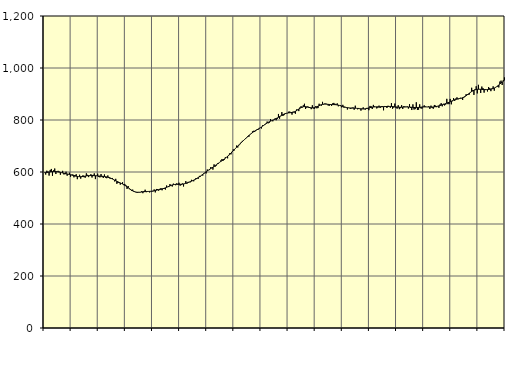
| Category | Piggar | Series 1 |
|---|---|---|
| nan | 598.3 | 597.13 |
| 87.0 | 590.2 | 597.61 |
| 87.0 | 604.9 | 598.3 |
| 87.0 | 601.5 | 599.08 |
| 87.0 | 586.2 | 599.73 |
| 87.0 | 607.9 | 600.44 |
| 87.0 | 611.7 | 601 |
| 87.0 | 585.3 | 601.47 |
| 87.0 | 606.5 | 601.78 |
| 87.0 | 613.4 | 601.8 |
| 87.0 | 592.2 | 601.57 |
| 87.0 | 601.4 | 601.05 |
| nan | 604.4 | 600.31 |
| 88.0 | 601.5 | 599.45 |
| 88.0 | 589.5 | 598.5 |
| 88.0 | 597.8 | 597.49 |
| 88.0 | 604.4 | 596.5 |
| 88.0 | 591 | 595.5 |
| 88.0 | 591.3 | 594.48 |
| 88.0 | 601.1 | 593.48 |
| 88.0 | 585.7 | 592.5 |
| 88.0 | 592.2 | 591.46 |
| 88.0 | 597.2 | 590.37 |
| 88.0 | 582 | 589.27 |
| nan | 589.6 | 588.13 |
| 89.0 | 590.7 | 586.98 |
| 89.0 | 579.5 | 585.85 |
| 89.0 | 588.3 | 584.75 |
| 89.0 | 591.4 | 583.74 |
| 89.0 | 572.4 | 582.9 |
| 89.0 | 582.8 | 582.31 |
| 89.0 | 589.4 | 582.03 |
| 89.0 | 574.5 | 582.03 |
| 89.0 | 580.7 | 582.28 |
| 89.0 | 587.4 | 582.78 |
| 89.0 | 579.9 | 583.46 |
| nan | 578.3 | 584.21 |
| 90.0 | 594.9 | 584.93 |
| 90.0 | 589.1 | 585.56 |
| 90.0 | 580.4 | 586.03 |
| 90.0 | 585.7 | 586.28 |
| 90.0 | 591.7 | 586.37 |
| 90.0 | 578.8 | 586.32 |
| 90.0 | 589 | 586.12 |
| 90.0 | 594.6 | 585.86 |
| 90.0 | 572.7 | 585.58 |
| 90.0 | 586.1 | 585.25 |
| 90.0 | 593.4 | 584.92 |
| nan | 580.6 | 584.61 |
| 91.0 | 579.4 | 584.27 |
| 91.0 | 592.1 | 583.88 |
| 91.0 | 580.3 | 583.48 |
| 91.0 | 577.1 | 583.04 |
| 91.0 | 590.6 | 582.49 |
| 91.0 | 578.1 | 581.81 |
| 91.0 | 576.2 | 580.98 |
| 91.0 | 586.6 | 579.93 |
| 91.0 | 580.8 | 578.66 |
| 91.0 | 574.1 | 577.12 |
| 91.0 | 574.4 | 575.28 |
| nan | 577 | 573.14 |
| 92.0 | 569.6 | 570.84 |
| 92.0 | 563.9 | 568.49 |
| 92.0 | 573.7 | 566.15 |
| 92.0 | 554.6 | 563.93 |
| 92.0 | 558.2 | 561.86 |
| 92.0 | 561.4 | 559.9 |
| 92.0 | 551.4 | 558 |
| 92.0 | 556.4 | 556.03 |
| 92.0 | 560.5 | 553.89 |
| 92.0 | 549.5 | 551.52 |
| 92.0 | 554.1 | 548.92 |
| nan | 549.1 | 546.04 |
| 93.0 | 535 | 542.91 |
| 93.0 | 545.9 | 539.64 |
| 93.0 | 534 | 536.31 |
| 93.0 | 530.6 | 533.08 |
| 93.0 | 527.6 | 530.13 |
| 93.0 | 532.2 | 527.54 |
| 93.0 | 523.9 | 525.43 |
| 93.0 | 524 | 523.83 |
| 93.0 | 521.6 | 522.74 |
| 93.0 | 519.7 | 522.13 |
| 93.0 | 523.2 | 521.96 |
| nan | 521.1 | 522.15 |
| 94.0 | 521.7 | 522.59 |
| 94.0 | 526.4 | 523.16 |
| 94.0 | 518.5 | 523.74 |
| 94.0 | 526.5 | 524.28 |
| 94.0 | 531.9 | 524.68 |
| 94.0 | 522.3 | 524.95 |
| 94.0 | 526.3 | 525.11 |
| 94.0 | 525.8 | 525.23 |
| 94.0 | 521.4 | 525.42 |
| 94.0 | 526.2 | 525.74 |
| 94.0 | 524.7 | 526.27 |
| nan | 525.8 | 527.02 |
| 95.0 | 532.9 | 527.95 |
| 95.0 | 521.6 | 528.97 |
| 95.0 | 534.7 | 530.02 |
| 95.0 | 534.2 | 531.04 |
| 95.0 | 528.1 | 531.95 |
| 95.0 | 535.3 | 532.84 |
| 95.0 | 537.8 | 533.77 |
| 95.0 | 529.7 | 534.82 |
| 95.0 | 538.4 | 536.06 |
| 95.0 | 534.5 | 537.52 |
| 95.0 | 532.6 | 539.17 |
| nan | 548 | 540.97 |
| 96.0 | 543.3 | 542.88 |
| 96.0 | 542 | 544.85 |
| 96.0 | 553.7 | 546.78 |
| 96.0 | 549.2 | 548.56 |
| 96.0 | 544.2 | 550.1 |
| 96.0 | 555.2 | 551.27 |
| 96.0 | 551.3 | 552.03 |
| 96.0 | 549.1 | 552.42 |
| 96.0 | 556.4 | 552.55 |
| 96.0 | 554.4 | 552.56 |
| 96.0 | 558.6 | 552.55 |
| nan | 547.3 | 552.62 |
| 97.0 | 549.7 | 552.86 |
| 97.0 | 555.9 | 553.35 |
| 97.0 | 544.3 | 554.11 |
| 97.0 | 555.8 | 555.11 |
| 97.0 | 564.8 | 556.39 |
| 97.0 | 555.1 | 557.88 |
| 97.0 | 562 | 559.52 |
| 97.0 | 560.5 | 561.24 |
| 97.0 | 560.3 | 563.01 |
| 97.0 | 569.9 | 564.77 |
| 97.0 | 565.4 | 566.58 |
| nan | 564.3 | 568.53 |
| 98.0 | 569.7 | 570.68 |
| 98.0 | 576.7 | 573.05 |
| 98.0 | 576.6 | 575.65 |
| 98.0 | 573.8 | 578.45 |
| 98.0 | 585 | 581.38 |
| 98.0 | 582.5 | 584.45 |
| 98.0 | 588.6 | 587.64 |
| 98.0 | 586.1 | 590.9 |
| 98.0 | 596 | 594.23 |
| 98.0 | 597.4 | 597.54 |
| 98.0 | 594.6 | 600.79 |
| nan | 609.6 | 603.97 |
| 99.0 | 607.6 | 607.04 |
| 99.0 | 607.3 | 609.95 |
| 99.0 | 618.3 | 612.76 |
| 99.0 | 617.3 | 615.58 |
| 99.0 | 609.2 | 618.45 |
| 99.0 | 629.3 | 621.39 |
| 99.0 | 620.4 | 624.46 |
| 99.0 | 624.6 | 627.64 |
| 99.0 | 632.9 | 630.88 |
| 99.0 | 632.1 | 634.16 |
| 99.0 | 637.5 | 637.45 |
| nan | 644.7 | 640.67 |
| 0.0 | 649.6 | 643.8 |
| 0.0 | 642.9 | 646.91 |
| 0.0 | 646.7 | 650.01 |
| 0.0 | 656.7 | 653.2 |
| 0.0 | 656.8 | 656.61 |
| 0.0 | 652.6 | 660.3 |
| 0.0 | 665.8 | 664.23 |
| 0.0 | 672.7 | 668.43 |
| 0.0 | 667.9 | 672.8 |
| 0.0 | 678.5 | 677.3 |
| 0.0 | 686.9 | 681.86 |
| nan | 683.2 | 686.41 |
| 1.0 | 690.5 | 690.92 |
| 1.0 | 701.7 | 695.4 |
| 1.0 | 694.2 | 699.87 |
| 1.0 | 702.6 | 704.26 |
| 1.0 | 706.9 | 708.54 |
| 1.0 | 714.4 | 712.73 |
| 1.0 | 719.6 | 716.87 |
| 1.0 | 722.2 | 720.94 |
| 1.0 | 725.8 | 724.99 |
| 1.0 | 727.5 | 729.05 |
| 1.0 | 733.8 | 733.06 |
| nan | 734.5 | 736.99 |
| 2.0 | 736.5 | 740.87 |
| 2.0 | 745.3 | 744.6 |
| 2.0 | 749.4 | 748.14 |
| 2.0 | 756.1 | 751.5 |
| 2.0 | 758.4 | 754.62 |
| 2.0 | 753.8 | 757.47 |
| 2.0 | 761.6 | 760.09 |
| 2.0 | 761.5 | 762.6 |
| 2.0 | 762.4 | 765.07 |
| 2.0 | 769.6 | 767.59 |
| 2.0 | 770 | 770.28 |
| nan | 767.5 | 773.18 |
| 3.0 | 779.8 | 776.27 |
| 3.0 | 779.3 | 779.49 |
| 3.0 | 781.2 | 782.72 |
| 3.0 | 786.9 | 785.76 |
| 3.0 | 794 | 788.56 |
| 3.0 | 787.4 | 791.13 |
| 3.0 | 789.9 | 793.43 |
| 3.0 | 803.7 | 795.5 |
| 3.0 | 797.9 | 797.45 |
| 3.0 | 794.9 | 799.37 |
| 3.0 | 801.4 | 801.34 |
| nan | 805.8 | 803.42 |
| 4.0 | 799.2 | 805.66 |
| 4.0 | 804.4 | 808 |
| 4.0 | 823.2 | 810.47 |
| 4.0 | 804.9 | 813.06 |
| 4.0 | 814.4 | 815.69 |
| 4.0 | 830.4 | 818.23 |
| 4.0 | 815.5 | 820.64 |
| 4.0 | 818.8 | 822.74 |
| 4.0 | 826.5 | 824.42 |
| 4.0 | 826.6 | 825.74 |
| 4.0 | 826.2 | 826.71 |
| nan | 831.8 | 827.38 |
| 5.0 | 832.5 | 827.89 |
| 5.0 | 827.7 | 828.39 |
| 5.0 | 820.7 | 829 |
| 5.0 | 831.8 | 829.94 |
| 5.0 | 828.5 | 831.45 |
| 5.0 | 824.1 | 833.52 |
| 5.0 | 840.4 | 836.1 |
| 5.0 | 840.3 | 839.11 |
| 5.0 | 834.2 | 842.29 |
| 5.0 | 848.4 | 845.29 |
| 5.0 | 852.9 | 847.86 |
| nan | 847.7 | 849.8 |
| 6.0 | 856.7 | 850.97 |
| 6.0 | 862.5 | 851.42 |
| 6.0 | 842.5 | 851.29 |
| 6.0 | 847.8 | 850.66 |
| 6.0 | 852 | 849.67 |
| 6.0 | 846.1 | 848.6 |
| 6.0 | 847 | 847.61 |
| 6.0 | 841.7 | 846.91 |
| 6.0 | 856.6 | 846.67 |
| 6.0 | 844.5 | 847 |
| 6.0 | 843.3 | 847.85 |
| nan | 853.3 | 849.22 |
| 7.0 | 844.9 | 851.02 |
| 7.0 | 845.9 | 853.05 |
| 7.0 | 862.5 | 855.17 |
| 7.0 | 858.3 | 857.2 |
| 7.0 | 855.1 | 858.89 |
| 7.0 | 869.8 | 860.14 |
| 7.0 | 859.2 | 860.92 |
| 7.0 | 863.2 | 861.2 |
| 7.0 | 863.2 | 861.08 |
| 7.0 | 860.6 | 860.68 |
| 7.0 | 855.7 | 860.2 |
| nan | 854.8 | 859.78 |
| 8.0 | 861 | 859.47 |
| 8.0 | 854.4 | 859.33 |
| 8.0 | 864 | 859.28 |
| 8.0 | 865.7 | 859.21 |
| 8.0 | 862.5 | 859.05 |
| 8.0 | 859.9 | 858.71 |
| 8.0 | 863.9 | 858.09 |
| 8.0 | 852.7 | 857.2 |
| 8.0 | 855.4 | 856.07 |
| 8.0 | 857.2 | 854.73 |
| 8.0 | 848.5 | 853.34 |
| nan | 858.3 | 851.93 |
| 9.0 | 847.4 | 850.58 |
| 9.0 | 850.3 | 849.35 |
| 9.0 | 848.9 | 848.29 |
| 9.0 | 840.4 | 847.41 |
| 9.0 | 846.1 | 846.78 |
| 9.0 | 845.2 | 846.4 |
| 9.0 | 842.3 | 846.14 |
| 9.0 | 846.8 | 845.94 |
| 9.0 | 848.3 | 845.79 |
| 9.0 | 839.6 | 845.6 |
| 9.0 | 855 | 845.32 |
| nan | 845.1 | 844.97 |
| 10.0 | 841.2 | 844.52 |
| 10.0 | 846.3 | 843.97 |
| 10.0 | 843.7 | 843.43 |
| 10.0 | 836.1 | 842.94 |
| 10.0 | 843.4 | 842.61 |
| 10.0 | 848.5 | 842.5 |
| 10.0 | 841.5 | 842.72 |
| 10.0 | 840.3 | 843.32 |
| 10.0 | 846.5 | 844.19 |
| 10.0 | 843.5 | 845.27 |
| 10.0 | 837.7 | 846.41 |
| nan | 854.1 | 847.48 |
| 11.0 | 853 | 848.44 |
| 11.0 | 842.3 | 849.23 |
| 11.0 | 858.1 | 849.82 |
| 11.0 | 852 | 850.24 |
| 11.0 | 851 | 850.5 |
| 11.0 | 844.5 | 850.61 |
| 11.0 | 847.5 | 850.64 |
| 11.0 | 855.2 | 850.63 |
| 11.0 | 846.3 | 850.67 |
| 11.0 | 853.7 | 850.81 |
| 11.0 | 853.6 | 851.01 |
| nan | 837.3 | 851.26 |
| 12.0 | 853.9 | 851.52 |
| 12.0 | 853.7 | 851.75 |
| 12.0 | 846.2 | 851.96 |
| 12.0 | 854.7 | 852.11 |
| 12.0 | 851.6 | 852.16 |
| 12.0 | 846.8 | 852.14 |
| 12.0 | 864.9 | 852.02 |
| 12.0 | 843.5 | 851.76 |
| 12.0 | 847.6 | 851.35 |
| 12.0 | 863.2 | 850.84 |
| 12.0 | 847.2 | 850.29 |
| nan | 843.5 | 849.76 |
| 13.0 | 856.8 | 849.33 |
| 13.0 | 841.7 | 849.1 |
| 13.0 | 845.6 | 849.07 |
| 13.0 | 857 | 849.24 |
| 13.0 | 842.5 | 849.57 |
| 13.0 | 853.4 | 849.87 |
| 13.0 | 851.4 | 850.11 |
| 13.0 | 850.6 | 850.24 |
| 13.0 | 852.3 | 850.25 |
| 13.0 | 844.1 | 850.06 |
| 13.0 | 860.7 | 849.73 |
| nan | 846.1 | 849.36 |
| 14.0 | 838.4 | 848.94 |
| 14.0 | 860.1 | 848.52 |
| 14.0 | 840.3 | 848.19 |
| 14.0 | 841.8 | 847.99 |
| 14.0 | 868.1 | 847.94 |
| 14.0 | 838.7 | 848.1 |
| 14.0 | 839.7 | 848.4 |
| 14.0 | 860.1 | 848.8 |
| 14.0 | 844.9 | 849.28 |
| 14.0 | 843.5 | 849.73 |
| 14.0 | 851.5 | 850.06 |
| nan | 856.2 | 850.22 |
| 15.0 | 852.1 | 850.29 |
| 15.0 | 849.9 | 850.3 |
| 15.0 | 849.8 | 850.2 |
| 15.0 | 852.6 | 850.04 |
| 15.0 | 842.5 | 849.85 |
| 15.0 | 855.2 | 849.69 |
| 15.0 | 846.6 | 849.77 |
| 15.0 | 843.3 | 850.11 |
| 15.0 | 857.8 | 850.59 |
| 15.0 | 855.3 | 851.3 |
| 15.0 | 849.3 | 852.23 |
| nan | 853.7 | 853.27 |
| 16.0 | 846.6 | 854.44 |
| 16.0 | 859.8 | 855.75 |
| 16.0 | 864.7 | 857.13 |
| 16.0 | 852.6 | 858.57 |
| 16.0 | 862.2 | 860.06 |
| 16.0 | 856 | 861.58 |
| 16.0 | 859.3 | 863.13 |
| 16.0 | 881.4 | 864.78 |
| 16.0 | 860.9 | 866.5 |
| 16.0 | 861.1 | 868.29 |
| 16.0 | 881.1 | 870.22 |
| nan | 860.3 | 872.28 |
| 17.0 | 872.2 | 874.36 |
| 17.0 | 884.1 | 876.3 |
| 17.0 | 873.2 | 877.95 |
| 17.0 | 882.7 | 879.31 |
| 17.0 | 887.1 | 880.47 |
| 17.0 | 879.6 | 881.49 |
| 17.0 | 883.1 | 882.36 |
| 17.0 | 885.4 | 883.19 |
| 17.0 | 883.2 | 884.24 |
| 17.0 | 876.9 | 885.75 |
| 17.0 | 885.3 | 887.74 |
| nan | 888.7 | 890.27 |
| 18.0 | 898.6 | 893.26 |
| 18.0 | 899.6 | 896.53 |
| 18.0 | 897.3 | 900 |
| 18.0 | 898.3 | 903.46 |
| 18.0 | 905.8 | 906.69 |
| 18.0 | 924 | 909.6 |
| 18.0 | 915 | 912.14 |
| 18.0 | 896.5 | 914.25 |
| 18.0 | 918.1 | 915.93 |
| 18.0 | 929.7 | 917.16 |
| 18.0 | 902.4 | 917.94 |
| nan | 935.3 | 918.31 |
| 19.0 | 917.6 | 918.33 |
| 19.0 | 904 | 918.05 |
| 19.0 | 928.6 | 917.67 |
| 19.0 | 922.8 | 917.3 |
| 19.0 | 905.4 | 917 |
| 19.0 | 918.7 | 916.79 |
| 19.0 | 916.1 | 916.75 |
| 19.0 | 909.7 | 916.95 |
| 19.0 | 926.7 | 917.35 |
| 19.0 | 922.6 | 917.92 |
| 19.0 | 910.9 | 918.69 |
| nan | 921.6 | 919.72 |
| 20.0 | 929.4 | 921.06 |
| 20.0 | 912.7 | 922.89 |
| 20.0 | 926 | 925.19 |
| 20.0 | 928.2 | 927.93 |
| 20.0 | 928.3 | 931.13 |
| 20.0 | 925.3 | 934.72 |
| 20.0 | 947.8 | 938.51 |
| 20.0 | 951.4 | 942.35 |
| 20.0 | 934.7 | 946.06 |
| 20.0 | 953.3 | 949.45 |
| 20.0 | 963.6 | 952.5 |